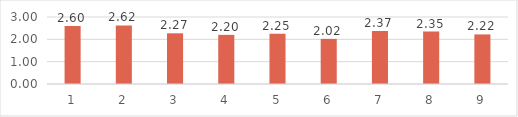
| Category | Series 0 |
|---|---|
| 0 | 2.6 |
| 1 | 2.62 |
| 2 | 2.27 |
| 3 | 2.2 |
| 4 | 2.25 |
| 5 | 2.02 |
| 6 | 2.37 |
| 7 | 2.35 |
| 8 | 2.22 |